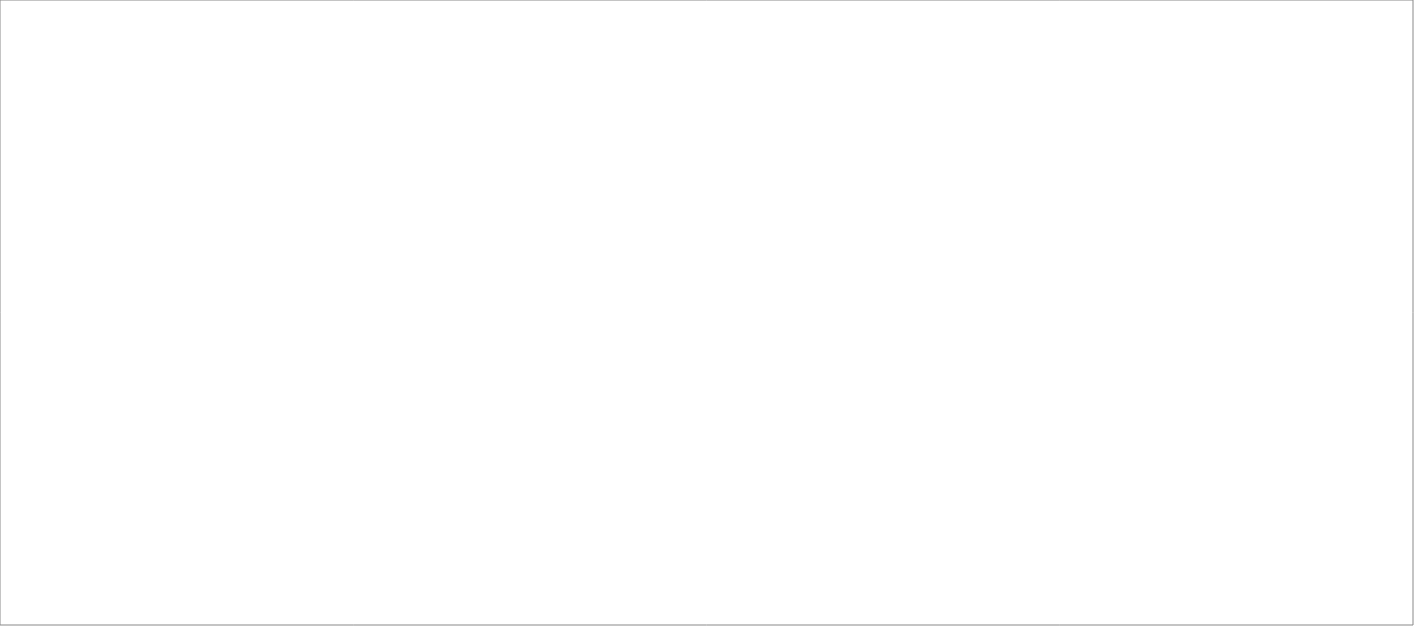
| Category | Total |
|---|---|
| Poolia Sverige AB | 85 |
| Randstad AB | 79.6 |
| Wise Professionals AB | 65 |
| Tarasso AB | 65 |
| Experis AB | 47.85 |